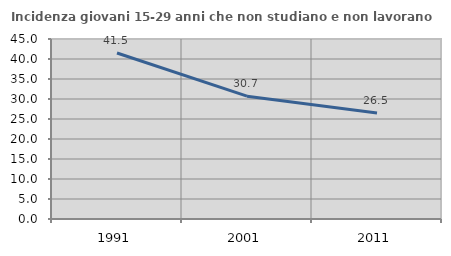
| Category | Incidenza giovani 15-29 anni che non studiano e non lavorano  |
|---|---|
| 1991.0 | 41.503 |
| 2001.0 | 30.711 |
| 2011.0 | 26.497 |